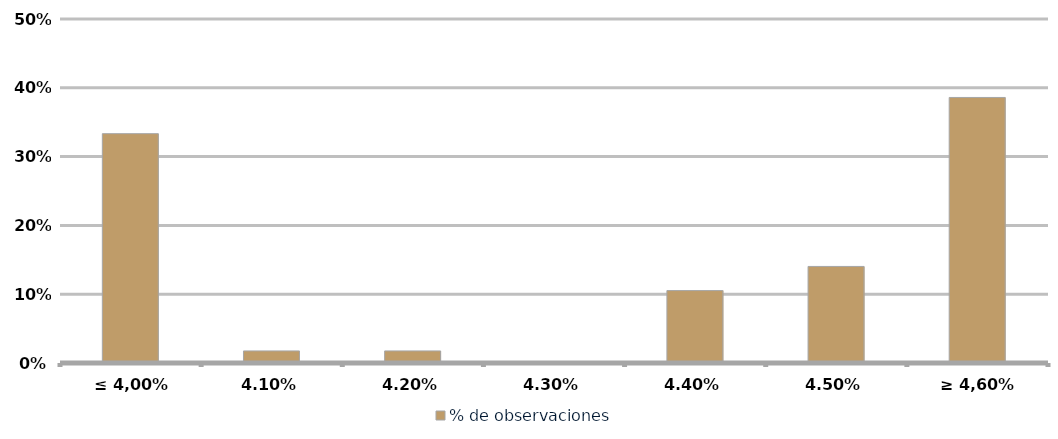
| Category | % de observaciones  |
|---|---|
| ≤ 4,00% | 0.333 |
| 4,10% | 0.018 |
| 4,20% | 0.018 |
| 4,30% | 0 |
| 4,40% | 0.105 |
| 4,50% | 0.14 |
| ≥ 4,60% | 0.386 |